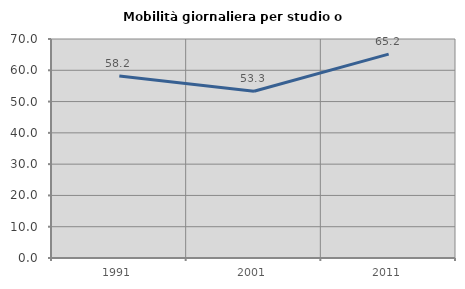
| Category | Mobilità giornaliera per studio o lavoro |
|---|---|
| 1991.0 | 58.151 |
| 2001.0 | 53.291 |
| 2011.0 | 65.169 |